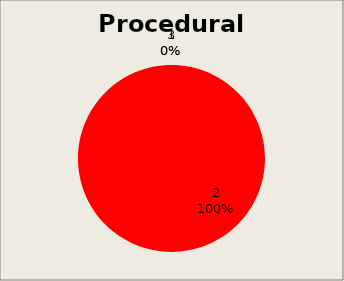
| Category | Series 1 |
|---|---|
| 0 | 0 |
| 1 | 33 |
| 2 | 0 |